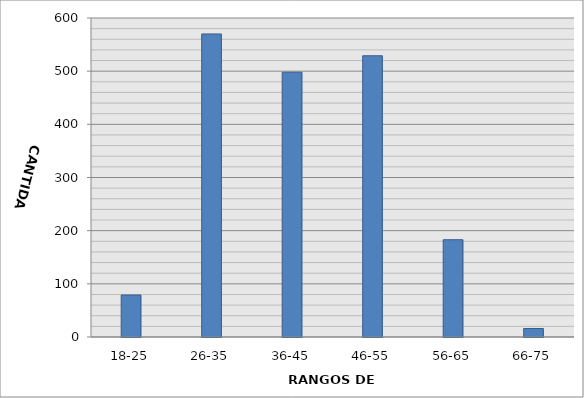
| Category | Series 0 |
|---|---|
| 18-25 | 79 |
| 26-35 | 570 |
| 36-45 | 498 |
| 46-55 | 529 |
| 56-65 | 183 |
| 66-75 | 16 |